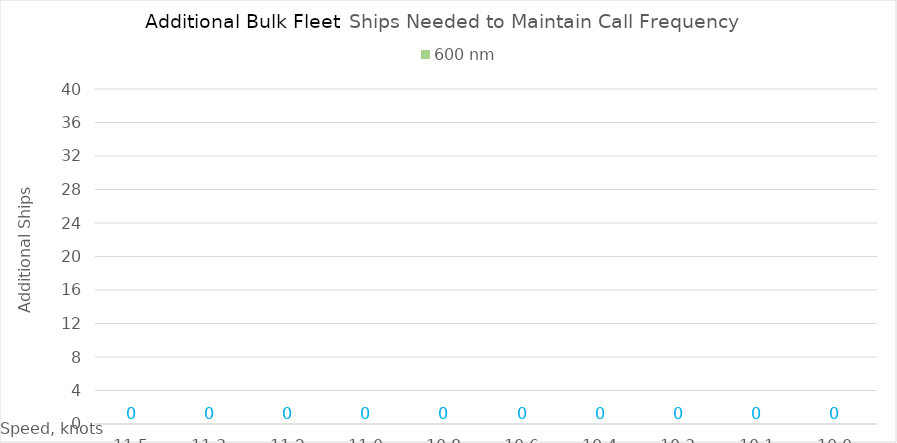
| Category | 600 |
|---|---|
| 11.52 | 0 |
| 11.34 | 0 |
| 11.16 | 0 |
| 10.98 | 0 |
| 10.8 | 0 |
| 10.620000000000001 | 0 |
| 10.440000000000001 | 0 |
| 10.260000000000002 | 0 |
| 10.080000000000002 | 0 |
| 10.0 | 0 |